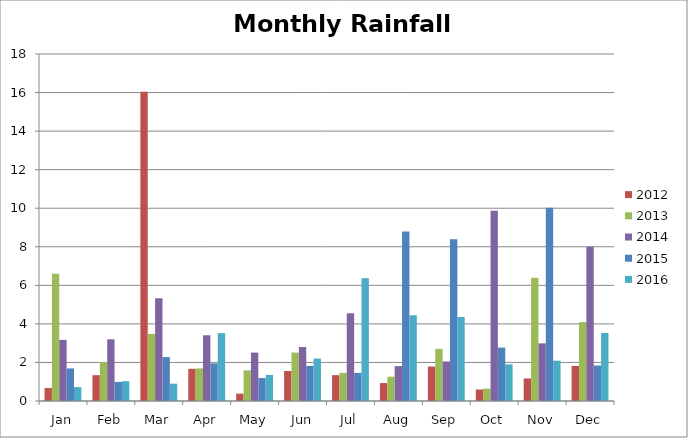
| Category | 2012 | 2013 | 2014 | 2015 | 2016 |
|---|---|---|---|---|---|
| Jan | 0.67 | 6.6 | 3.17 | 1.69 | 0.72 |
| Feb | 1.34 | 2.02 | 3.2 | 0.99 | 1.03 |
| Mar | 16.04 | 3.48 | 5.33 | 2.28 | 0.9 |
| Apr | 1.67 | 1.69 | 3.41 | 1.95 | 3.52 |
| May | 0.38 | 1.59 | 2.51 | 1.19 | 1.35 |
| Jun | 1.555 | 2.51 | 2.8 | 1.82 | 2.2 |
| Jul | 1.34 | 1.46 | 4.55 | 1.46 | 6.37 |
| Aug | 0.93 | 1.26 | 1.81 | 8.79 | 4.45 |
| Sep | 1.785 | 2.7 | 2.05 | 8.39 | 4.36 |
| Oct | 0.595 | 0.64 | 9.87 | 2.77 | 1.9 |
| Nov | 1.17 | 6.39 | 2.99 | 10.03 | 2.09 |
| Dec | 1.82 | 4.09 | 8 | 1.84 | 3.53 |